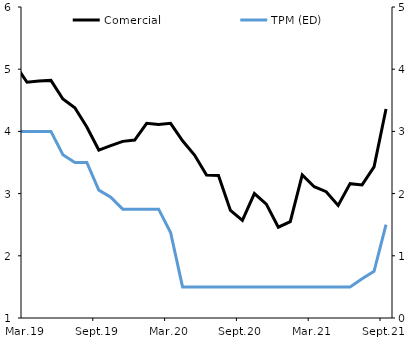
| Category | Comercial |
|---|---|
| 2013-01-01 | 7.935 |
| 2013-02-01 | 8.748 |
| 2013-03-01 | 6.842 |
| 2013-04-01 | 7.154 |
| 2013-05-01 | 7.092 |
| 2013-06-01 | 7.005 |
| 2013-07-01 | 7.236 |
| 2013-08-01 | 7.125 |
| 2013-09-01 | 6.895 |
| 2013-10-01 | 7.188 |
| 2013-11-01 | 6.639 |
| 2013-12-01 | 6.44 |
| 2014-01-01 | 6.42 |
| 2014-02-01 | 6.35 |
| 2014-03-01 | 6.26 |
| 2014-04-01 | 5.97 |
| 2014-05-01 | 5.8 |
| 2014-06-01 | 6.2 |
| 2014-07-01 | 5.65 |
| 2014-08-01 | 5.5 |
| 2014-09-01 | 5.26 |
| 2014-10-01 | 5.32 |
| 2014-11-01 | 5.22 |
| 2014-12-01 | 5.27 |
| 2015-01-01 | 5.28 |
| 2015-02-01 | 5.52 |
| 2015-03-01 | 5.45 |
| 2015-04-01 | 5.57 |
| 2015-05-01 | 5.28 |
| 2015-06-01 | 5.71 |
| 2015-07-01 | 5.53 |
| 2015-08-01 | 5.7 |
| 2015-09-01 | 5.52 |
| 2015-10-01 | 5.76 |
| 2015-11-01 | 5.61 |
| 2015-12-01 | 5.91 |
| 2016-01-01 | 6.13 |
| 2016-02-01 | 6.36 |
| 2016-03-01 | 6.1 |
| 2016-04-01 | 5.92 |
| 2016-05-01 | 5.77 |
| 2016-06-01 | 5.78 |
| 2016-07-01 | 5.68 |
| 2016-08-01 | 5.79 |
| 2016-09-01 | 5.86 |
| 2016-10-01 | 5.62 |
| 2016-11-01 | 5.61 |
| 2016-12-01 | 5.53 |
| 2017-01-01 | 5.51 |
| 2017-02-01 | 5.58 |
| 2017-03-01 | 5.32 |
| 2017-04-01 | 4.77 |
| 2017-05-01 | 4.88 |
| 2017-06-01 | 4.8 |
| 2017-07-01 | 4.81 |
| 2017-08-01 | 4.54 |
| 2017-09-01 | 4.56 |
| 2017-10-01 | 4.6 |
| 2017-11-01 | 4.54 |
| 2017-12-01 | 4.61 |
| 2018-01-01 | 4.54 |
| 2018-02-01 | 4.64 |
| 2018-03-01 | 4.25 |
| 2018-04-01 | 4.43 |
| 2018-05-01 | 4.62 |
| 2018-06-01 | 4.71 |
| 2018-07-01 | 4.33 |
| 2018-08-01 | 4.57 |
| 2018-09-01 | 4.44 |
| 2018-10-01 | 4.69 |
| 2018-11-01 | 4.74 |
| 2018-12-01 | 4.9 |
| 2019-01-01 | 4.9 |
| 2019-02-01 | 5.08 |
| 2019-03-01 | 4.79 |
| 2019-04-01 | 4.81 |
| 2019-05-01 | 4.82 |
| 2019-06-01 | 4.52 |
| 2019-07-01 | 4.38 |
| 2019-08-01 | 4.07 |
| 2019-09-01 | 3.7 |
| 2019-10-01 | 3.77 |
| 2019-11-01 | 3.84 |
| 2019-12-01 | 3.86 |
| 2020-01-01 | 4.13 |
| 2020-02-01 | 4.11 |
| 2020-03-01 | 4.13 |
| 2020-04-01 | 3.85 |
| 2020-05-01 | 3.62 |
| 2020-06-01 | 3.3 |
| 2020-07-01 | 3.29 |
| 2020-08-01 | 2.73 |
| 2020-09-01 | 2.57 |
| 2020-10-01 | 3 |
| 2020-11-01 | 2.83 |
| 2020-12-01 | 2.46 |
| 2021-01-01 | 2.55 |
| 2021-02-01 | 3.3 |
| 2021-03-01 | 3.11 |
| 2021-04-01 | 3.03 |
| 2021-05-01 | 2.81 |
| 2021-06-01 | 3.16 |
| 2021-07-01 | 3.14 |
| 2021-08-01 | 3.43 |
| 2021-09-01 | 4.36 |